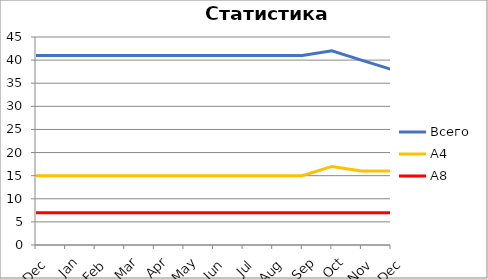
| Category | Всего | А4 | A8 |
|---|---|---|---|
| 0 | 41 | 15 | 7 |
| 1 | 41 | 15 | 7 |
| 2 | 41 | 15 | 7 |
| 3 | 41 | 15 | 7 |
| 4 | 41 | 15 | 7 |
| 5 | 41 | 15 | 7 |
| 6 | 41 | 15 | 7 |
| 7 | 41 | 15 | 7 |
| 8 | 41 | 15 | 7 |
| 9 | 41 | 15 | 7 |
| 10 | 42 | 17 | 7 |
| 11 | 40 | 16 | 7 |
| 12 | 38 | 16 | 7 |